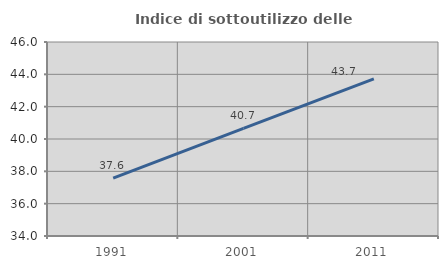
| Category | Indice di sottoutilizzo delle abitazioni  |
|---|---|
| 1991.0 | 37.582 |
| 2001.0 | 40.653 |
| 2011.0 | 43.717 |